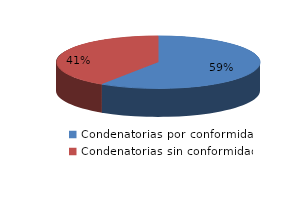
| Category | Series 0 |
|---|---|
| 0 | 16 |
| 1 | 11 |